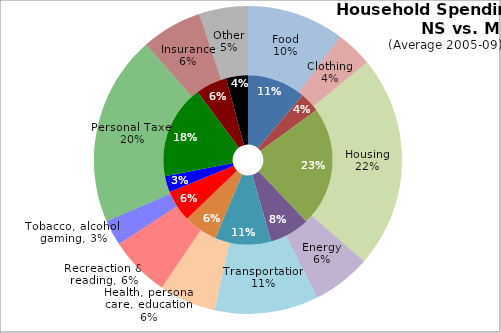
| Category | NS | MB |
|---|---|---|
| Food | 6520.4 | 6362.8 |
| Clothing | 2232.2 | 2398 |
| Housing | 13410.6 | 13911.2 |
| Energy | 4495.4 | 3847.4 |
| Transportation | 6259.2 | 6778.8 |
| Health, personal care, education | 3785.2 | 3719.6 |
| Recreaction & reading | 3526 | 3958.6 |
| Tobacco, alcohol, gaming | 1812.2 | 1664.8 |
| Personal Taxes | 10497 | 12463.2 |
| Insurance | 3483.6 | 3956.8 |
| Other | 2438.4 | 3201.6 |